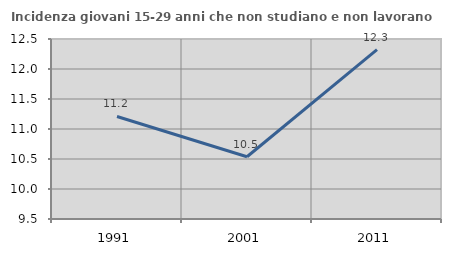
| Category | Incidenza giovani 15-29 anni che non studiano e non lavorano  |
|---|---|
| 1991.0 | 11.209 |
| 2001.0 | 10.537 |
| 2011.0 | 12.322 |